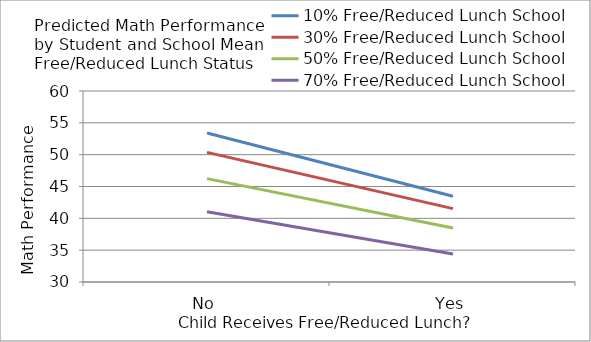
| Category | 10% Free/Reduced Lunch School | 30% Free/Reduced Lunch School | 50% Free/Reduced Lunch School | 70% Free/Reduced Lunch School |
|---|---|---|---|---|
| No | 53.408 | 50.362 | 46.233 | 41.02 |
| Yes | 43.463 | 41.52 | 38.495 | 34.385 |